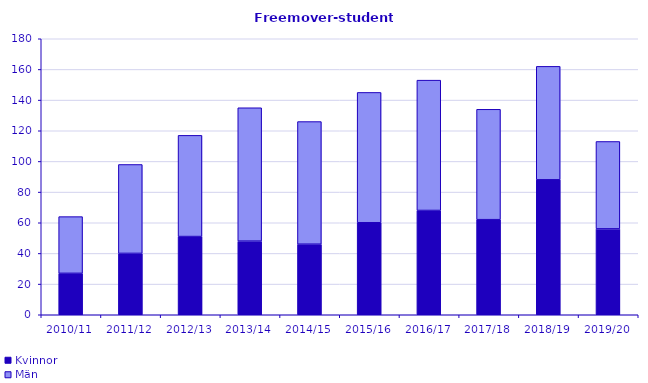
| Category | Kvinnor | Män |
|---|---|---|
| 2010/11 | 27 | 37 |
| 2011/12 | 40 | 58 |
| 2012/13 | 51 | 66 |
| 2013/14 | 48 | 87 |
| 2014/15 | 46 | 80 |
| 2015/16 | 60 | 85 |
| 2016/17 | 68 | 85 |
| 2017/18 | 62 | 72 |
| 2018/19 | 88 | 74 |
| 2019/20 | 56 | 57 |